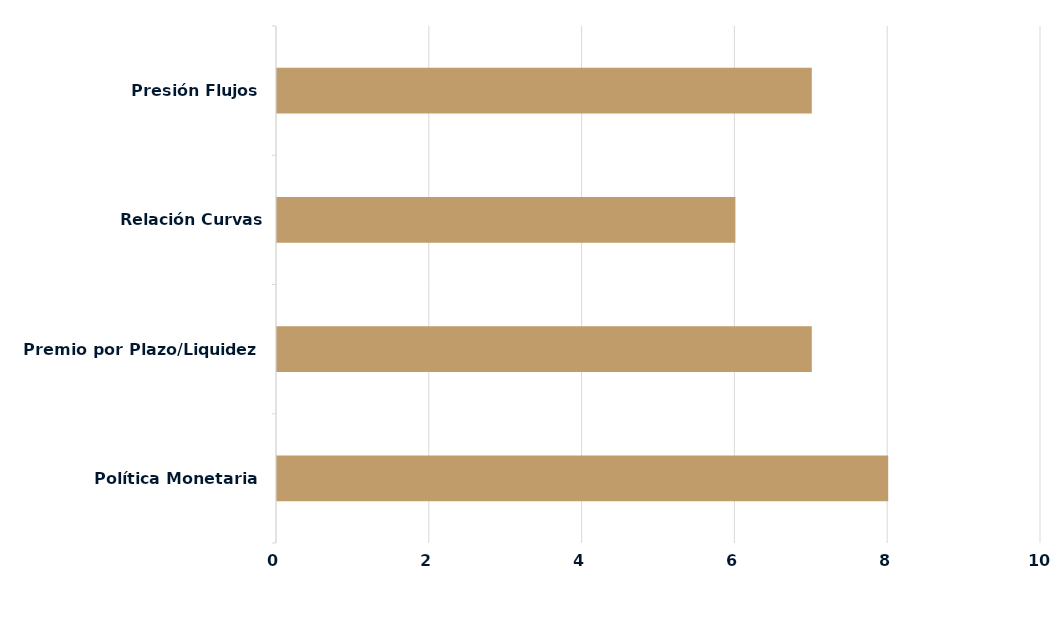
| Category | Series 0 |
|---|---|
| Política Monetaria | 8 |
| Premio por Plazo/Liquidez | 7 |
| Relación Curvas Internacionales | 6 |
| Presión Flujos | 7 |